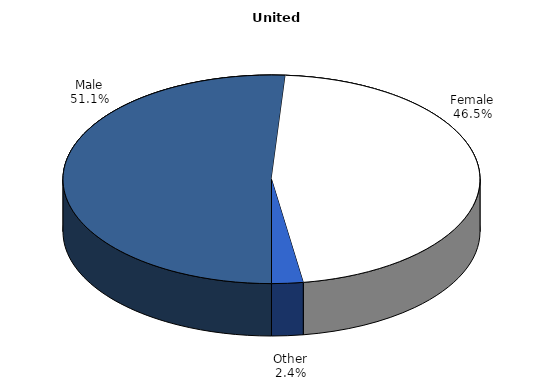
| Category | United States  |
|---|---|
| Male | 0.511 |
| Female | 0.465 |
| Other | 0.024 |